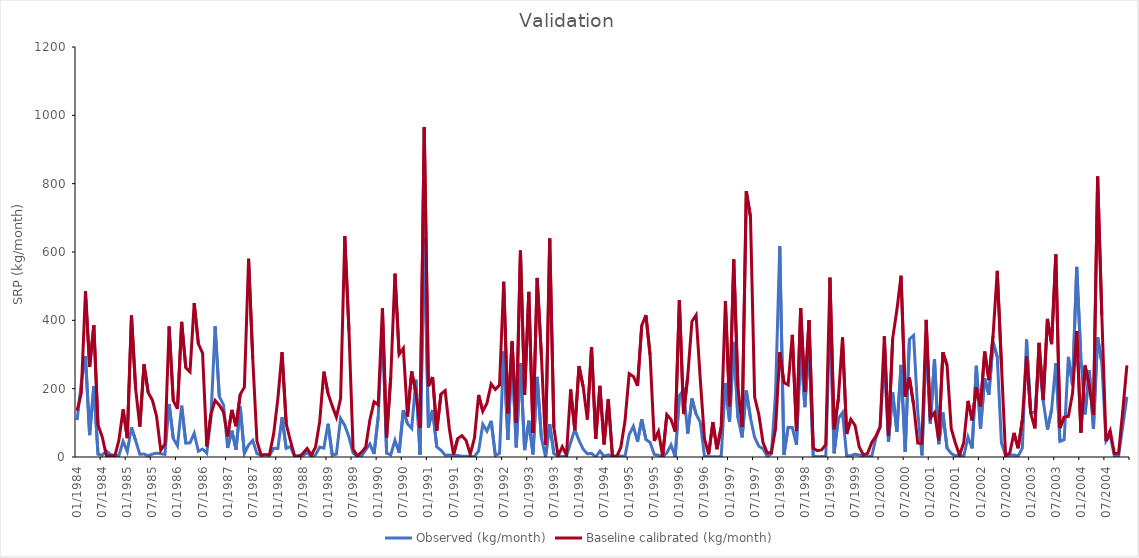
| Category | Observed (kg/month) | Baseline calibrated (kg/month) |
|---|---|---|
| 1984-01-01 | 108.048 | 135.9 |
| 1984-02-01 | 216.39 | 187 |
| 1984-03-01 | 294.928 | 484.6 |
| 1984-04-01 | 64.198 | 263.6 |
| 1984-05-01 | 207.227 | 386 |
| 1984-06-01 | 8.047 | 93.82 |
| 1984-07-01 | 5.303 | 59.36 |
| 1984-08-01 | 17.606 | 4.059 |
| 1984-09-01 | 7.118 | 3.465 |
| 1984-10-01 | 4.924 | 1.896 |
| 1984-11-01 | 4.593 | 49.46 |
| 1984-12-01 | 45.871 | 139.2 |
| 1985-01-01 | 16.212 | 55.19 |
| 1985-02-01 | 86.905 | 414 |
| 1985-03-01 | 47.809 | 199.6 |
| 1985-04-01 | 8.195 | 89.16 |
| 1985-05-01 | 8.622 | 271.1 |
| 1985-06-01 | 3.564 | 188.7 |
| 1985-07-01 | 8.514 | 166.3 |
| 1985-08-01 | 11.326 | 119.3 |
| 1985-09-01 | 9.684 | 20.19 |
| 1985-10-01 | 7.808 | 38.03 |
| 1985-11-01 | 155.088 | 381.9 |
| 1985-12-01 | 54.306 | 164.9 |
| 1986-01-01 | 32.9 | 140.7 |
| 1986-02-01 | 150.128 | 395.4 |
| 1986-03-01 | 40.3 | 261.1 |
| 1986-04-01 | 41.448 | 249.3 |
| 1986-05-01 | 69.764 | 450.2 |
| 1986-06-01 | 16.77 | 331 |
| 1986-07-01 | 23.451 | 304.3 |
| 1986-08-01 | 10.859 | 31.16 |
| 1986-09-01 | 115.216 | 125.1 |
| 1986-10-01 | 382.571 | 165.5 |
| 1986-11-01 | 177.652 | 151.8 |
| 1986-12-01 | 152.502 | 131.7 |
| 1987-01-01 | 26.45 | 60.33 |
| 1987-02-01 | 77.159 | 137.8 |
| 1987-03-01 | 21.367 | 90.11 |
| 1987-04-01 | 147.656 | 183.1 |
| 1987-05-01 | 10.481 | 204.5 |
| 1987-06-01 | 34.903 | 580.4 |
| 1987-07-01 | 48.638 | 287.4 |
| 1987-08-01 | 9.65 | 46.54 |
| 1987-09-01 | 5.763 | 5.593 |
| 1987-10-01 | 6.504 | 6.366 |
| 1987-11-01 | 4.396 | 7.368 |
| 1987-12-01 | 25.474 | 67.75 |
| 1988-01-01 | 24.74 | 170.3 |
| 1988-02-01 | 115.843 | 306.6 |
| 1988-03-01 | 25.402 | 97.17 |
| 1988-04-01 | 30.733 | 47.59 |
| 1988-05-01 | 1.336 | 3.434 |
| 1988-06-01 | 4.697 | 0.273 |
| 1988-07-01 | 4.204 | 10.87 |
| 1988-08-01 | 12.739 | 25.03 |
| 1988-09-01 | 2.21 | 5.664 |
| 1988-10-01 | 6.324 | 28.38 |
| 1988-11-01 | 29.064 | 103.4 |
| 1988-12-01 | 25.99 | 249.6 |
| 1989-01-01 | 97.28 | 185.7 |
| 1989-02-01 | 5.523 | 149.6 |
| 1989-03-01 | 8.506 | 116.2 |
| 1989-04-01 | 113.306 | 171.2 |
| 1989-05-01 | 92.401 | 646.8 |
| 1989-06-01 | 58.739 | 369.9 |
| 1989-07-01 | 11.434 | 22.36 |
| 1989-08-01 | 1.772 | 3.503 |
| 1989-09-01 | 2.798 | 14.02 |
| 1989-10-01 | 20.788 | 28.5 |
| 1989-11-01 | 38.262 | 108.4 |
| 1989-12-01 | 8.852 | 161.5 |
| 1990-01-01 | 118.282 | 152.7 |
| 1990-02-01 | 396.539 | 434.9 |
| 1990-03-01 | 11.19 | 56.69 |
| 1990-04-01 | 6.731 | 235.1 |
| 1990-05-01 | 49.139 | 536.5 |
| 1990-06-01 | 12.41 | 300.1 |
| 1990-07-01 | 137.158 | 318.5 |
| 1990-08-01 | 97.605 | 118.5 |
| 1990-09-01 | 83.53 | 250.1 |
| 1990-10-01 | 226.531 | 188.3 |
| 1990-11-01 | 6.834 | 85.06 |
| 1990-12-01 | 643.886 | 965.3 |
| 1991-01-01 | 86.483 | 207.4 |
| 1991-02-01 | 137.664 | 233.7 |
| 1991-03-01 | 29.412 | 77.04 |
| 1991-04-01 | 19.83 | 184.5 |
| 1991-05-01 | 5.333 | 194.4 |
| 1991-06-01 | 5.635 | 82.84 |
| 1991-07-01 | 3.546 | 6.62 |
| 1991-08-01 | 4.541 | 53.85 |
| 1991-09-01 | 2.308 | 62.58 |
| 1991-10-01 | 2.427 | 48.42 |
| 1991-11-01 | 1.673 | 8.192 |
| 1991-12-01 | 1.274 | 55.44 |
| 1992-01-01 | 17.896 | 181.6 |
| 1992-02-01 | 95.815 | 134 |
| 1992-03-01 | 75.682 | 157.5 |
| 1992-04-01 | 105.802 | 213.7 |
| 1992-05-01 | 4.631 | 198 |
| 1992-06-01 | 10.257 | 210.6 |
| 1992-07-01 | 309.127 | 512.9 |
| 1992-08-01 | 49.822 | 128.1 |
| 1992-09-01 | 303.124 | 338.6 |
| 1992-10-01 | 28.169 | 100.9 |
| 1992-11-01 | 275.04 | 604 |
| 1992-12-01 | 20.181 | 181.3 |
| 1993-01-01 | 106.071 | 483.4 |
| 1993-02-01 | 7.727 | 70.81 |
| 1993-03-01 | 234.616 | 524.1 |
| 1993-04-01 | 57.076 | 298.7 |
| 1993-05-01 | 0.72 | 35.48 |
| 1993-06-01 | 96.05 | 639.6 |
| 1993-07-01 | 9.66 | 86.04 |
| 1993-08-01 | 2.242 | 3.163 |
| 1993-09-01 | 1.398 | 30.03 |
| 1993-10-01 | 2.323 | 6.198 |
| 1993-11-01 | 42.304 | 197.5 |
| 1993-12-01 | 80.767 | 78.4 |
| 1994-01-01 | 48.385 | 266.1 |
| 1994-02-01 | 22.905 | 205.6 |
| 1994-03-01 | 9.444 | 109.7 |
| 1994-04-01 | 10.566 | 321.7 |
| 1994-05-01 | 0 | 52.86 |
| 1994-06-01 | 17.198 | 208.1 |
| 1994-07-01 | 2.049 | 36.93 |
| 1994-08-01 | 6.271 | 168.9 |
| 1994-09-01 | 1.894 | 2.074 |
| 1994-10-01 | 4.006 | 0.282 |
| 1994-11-01 | 2.637 | 28.34 |
| 1994-12-01 | 2.018 | 105.3 |
| 1995-01-01 | 65.525 | 243.9 |
| 1995-02-01 | 89.851 | 235.9 |
| 1995-03-01 | 44.718 | 208.2 |
| 1995-04-01 | 109.999 | 384.9 |
| 1995-05-01 | 51.345 | 415.2 |
| 1995-06-01 | 42.493 | 297.9 |
| 1995-07-01 | 7.709 | 47.29 |
| 1995-08-01 | 4.95 | 74.57 |
| 1995-09-01 | 0.82 | 1.668 |
| 1995-10-01 | 11.913 | 124 |
| 1995-11-01 | 35.714 | 109.8 |
| 1995-12-01 | 0.619 | 74.53 |
| 1996-01-01 | 179.914 | 459.6 |
| 1996-02-01 | 195.743 | 125.7 |
| 1996-03-01 | 68.605 | 235.9 |
| 1996-04-01 | 170.995 | 396.6 |
| 1996-05-01 | 125.428 | 415.3 |
| 1996-06-01 | 101.509 | 226.9 |
| 1996-07-01 | 1.794 | 54.02 |
| 1996-08-01 | 1.026 | 7.633 |
| 1996-09-01 | 0.969 | 102.2 |
| 1996-10-01 | 0.251 | 22.77 |
| 1996-11-01 | 1.953 | 88.83 |
| 1996-12-01 | 216.486 | 456.7 |
| 1997-01-01 | 103.103 | 148.6 |
| 1997-02-01 | 336.816 | 578.1 |
| 1997-03-01 | 114.536 | 205.8 |
| 1997-04-01 | 57.273 | 87.74 |
| 1997-05-01 | 194.686 | 778.1 |
| 1997-06-01 | 113.932 | 703.4 |
| 1997-07-01 | 57.085 | 174.7 |
| 1997-08-01 | 31.687 | 124.4 |
| 1997-09-01 | 24.325 | 42.2 |
| 1997-10-01 | 2.005 | 12.59 |
| 1997-11-01 | 9.142 | 12.97 |
| 1997-12-01 | 187.759 | 83.17 |
| 1998-01-01 | 617.114 | 306.4 |
| 1998-02-01 | 5.892 | 217.9 |
| 1998-03-01 | 86.87 | 211.4 |
| 1998-04-01 | 86.199 | 357.6 |
| 1998-05-01 | 35.61 | 75.91 |
| 1998-06-01 | 327.342 | 436 |
| 1998-07-01 | 145.986 | 190.6 |
| 1998-08-01 | 333.127 | 400.6 |
| 1998-09-01 | 2.341 | 26.1 |
| 1998-10-01 | 0.655 | 18.21 |
| 1998-11-01 | 1.225 | 20.77 |
| 1998-12-01 | 0.836 | 35.86 |
| 1999-01-01 | 419.578 | 525 |
| 1999-02-01 | 10.884 | 81.07 |
| 1999-03-01 | 112.747 | 169.7 |
| 1999-04-01 | 129.775 | 350 |
| 1999-05-01 | 2.535 | 67.35 |
| 1999-06-01 | 4.107 | 110.1 |
| 1999-07-01 | 8.026 | 92.87 |
| 1999-08-01 | 5.76 | 29.5 |
| 1999-09-01 | 2.939 | 6.174 |
| 1999-10-01 | 2.101 | 10.53 |
| 1999-11-01 | 2.25 | 42.46 |
| 1999-12-01 | 56.072 | 61.37 |
| 2000-01-01 | 87.264 | 89.04 |
| 2000-02-01 | 296.438 | 353.1 |
| 2000-03-01 | 43.938 | 62.79 |
| 2000-04-01 | 189.142 | 347.5 |
| 2000-05-01 | 74.512 | 430 |
| 2000-06-01 | 269.388 | 530.6 |
| 2000-07-01 | 14.505 | 176.7 |
| 2000-08-01 | 345.023 | 232.3 |
| 2000-09-01 | 355.642 | 153 |
| 2000-10-01 | 130.954 | 40.44 |
| 2000-11-01 | 4.646 | 39.55 |
| 2000-12-01 | 341.447 | 401.2 |
| 2001-01-01 | 97.799 | 114 |
| 2001-02-01 | 286.617 | 130 |
| 2001-03-01 | 37.502 | 48.57 |
| 2001-04-01 | 129.98 | 306.5 |
| 2001-05-01 | 25.652 | 268.3 |
| 2001-06-01 | 10.293 | 82.94 |
| 2001-07-01 | 3.379 | 40.16 |
| 2001-08-01 | 7.077 | 5.377 |
| 2001-09-01 | 2.654 | 43.09 |
| 2001-10-01 | 58.732 | 164.3 |
| 2001-11-01 | 25.232 | 107.2 |
| 2001-12-01 | 266.961 | 204.1 |
| 2002-01-01 | 82.396 | 148 |
| 2002-02-01 | 230.058 | 308.5 |
| 2002-03-01 | 182.048 | 225.2 |
| 2002-04-01 | 337.045 | 355.3 |
| 2002-05-01 | 292.91 | 544.7 |
| 2002-06-01 | 41.472 | 270.6 |
| 2002-07-01 | 2.936 | 4.125 |
| 2002-08-01 | 4.854 | 11.28 |
| 2002-09-01 | 5.731 | 70.55 |
| 2002-10-01 | 2.747 | 25.56 |
| 2002-11-01 | 25.732 | 109.2 |
| 2002-12-01 | 343.991 | 295.1 |
| 2003-01-01 | 131.254 | 128.3 |
| 2003-02-01 | 129.353 | 83.57 |
| 2003-03-01 | 287.804 | 334 |
| 2003-04-01 | 163.033 | 167.2 |
| 2003-05-01 | 80.265 | 404.1 |
| 2003-06-01 | 138.758 | 330.3 |
| 2003-07-01 | 274.361 | 592.6 |
| 2003-08-01 | 45.613 | 84.84 |
| 2003-09-01 | 50.596 | 117 |
| 2003-10-01 | 293.092 | 118.6 |
| 2003-11-01 | 209.705 | 186.3 |
| 2003-12-01 | 556.546 | 368.3 |
| 2004-01-01 | 290.341 | 70.95 |
| 2004-02-01 | 124.641 | 267.6 |
| 2004-03-01 | 254.19 | 207.9 |
| 2004-04-01 | 82.878 | 122.7 |
| 2004-05-01 | 350.484 | 820.8 |
| 2004-06-01 | 276.449 | 414.7 |
| 2004-07-01 | 46.086 | 47.32 |
| 2004-08-01 | 63.524 | 76.55 |
| 2004-09-01 | 3.097 | 10.22 |
| 2004-10-01 | 2.628 | 10.6 |
| 2004-11-01 | 89.18 | 134.4 |
| 2004-12-01 | 176.158 | 267.9 |